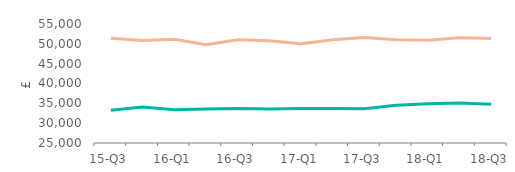
| Category | First-time
buyers | Home movers |
|---|---|---|
| 15-Q3 | 33242 | 51406 |
| 15-Q4 | 34087 | 50858 |
| 16-Q1 | 33382 | 51169 |
| 16-Q2 | 33577 | 49795 |
| 16-Q3 | 33708 | 51000 |
| 16-Q4 | 33555 | 50787 |
| 17-Q1 | 33682 | 50033 |
| 17-Q2 | 33676 | 51000 |
| 17-Q3 | 33639 | 51623.5 |
| 17-Q4 | 34530.5 | 51016.5 |
| 18-Q1 | 34898.5 | 50895.5 |
| 18-Q2 | 35089 | 51537 |
| 18-Q3 | 34750.5 | 51329 |